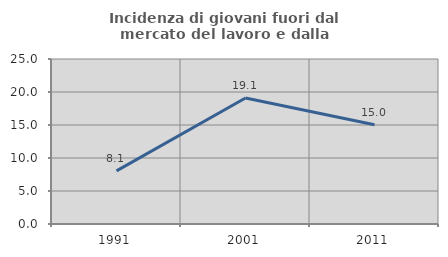
| Category | Incidenza di giovani fuori dal mercato del lavoro e dalla formazione  |
|---|---|
| 1991.0 | 8.058 |
| 2001.0 | 19.088 |
| 2011.0 | 15.028 |